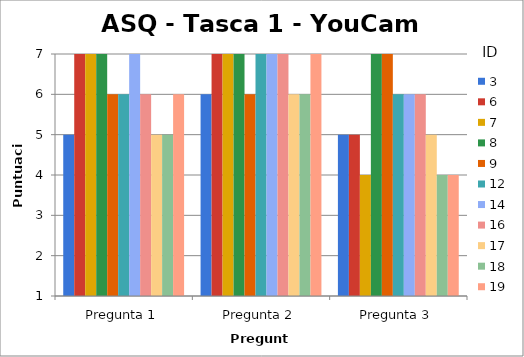
| Category | 3 | 6 | 7 | 8 | 9 | 12 | 14 | 16 | 17 | 18 | 19 |
|---|---|---|---|---|---|---|---|---|---|---|---|
| Pregunta 1 | 5 | 7 | 7 | 7 | 6 | 6 | 7 | 6 | 5 | 5 | 6 |
| Pregunta 2 | 6 | 7 | 7 | 7 | 6 | 7 | 7 | 7 | 6 | 6 | 7 |
| Pregunta 3 | 5 | 5 | 4 | 7 | 7 | 6 | 6 | 6 | 5 | 4 | 4 |